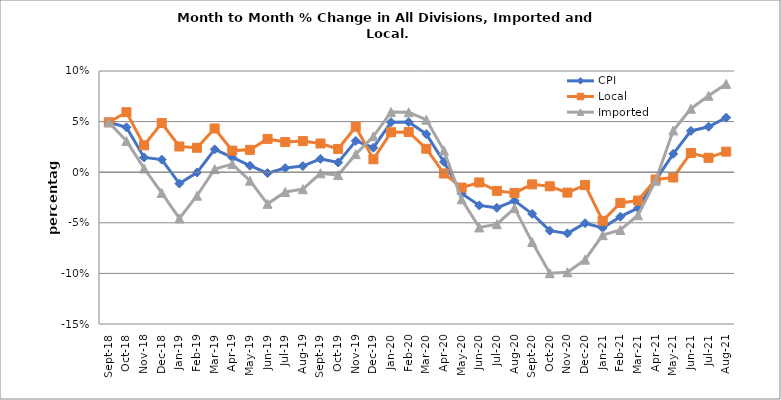
| Category | CPI | Local | Imported |
|---|---|---|---|
| 2018-09-01 | 0.049 | 0.049 | 0.049 |
| 2018-10-01 | 0.044 | 0.059 | 0.031 |
| 2018-11-01 | 0.015 | 0.027 | 0.004 |
| 2018-12-01 | 0.012 | 0.049 | -0.021 |
| 2019-01-01 | -0.011 | 0.025 | -0.046 |
| 2019-02-01 | 0 | 0.024 | -0.023 |
| 2019-03-01 | 0.023 | 0.043 | 0.003 |
| 2019-04-01 | 0.015 | 0.021 | 0.008 |
| 2019-05-01 | 0.006 | 0.022 | -0.008 |
| 2019-06-01 | -0.001 | 0.033 | -0.031 |
| 2019-07-01 | 0.004 | 0.03 | -0.02 |
| 2019-08-01 | 0.006 | 0.031 | -0.017 |
| 2019-09-01 | 0.013 | 0.028 | -0.001 |
| 2019-10-01 | 0.01 | 0.023 | -0.003 |
| 2019-11-01 | 0.031 | 0.045 | 0.018 |
| 2019-12-01 | 0.024 | 0.013 | 0.035 |
| 2020-01-01 | 0.049 | 0.039 | 0.059 |
| 2020-02-01 | 0.05 | 0.04 | 0.059 |
| 2020-03-01 | 0.038 | 0.023 | 0.052 |
| 2020-04-01 | 0.01 | -0.001 | 0.021 |
| 2020-05-01 | -0.021 | -0.015 | -0.027 |
| 2020-06-01 | -0.033 | -0.01 | -0.055 |
| 2020-07-01 | -0.035 | -0.018 | -0.051 |
| 2020-08-01 | -0.028 | -0.02 | -0.036 |
| 2020-09-01 | -0.041 | -0.012 | -0.069 |
| 2020-10-01 | -0.058 | -0.014 | -0.1 |
| 2020-11-01 | -0.06 | -0.02 | -0.099 |
| 2020-12-01 | -0.05 | -0.013 | -0.086 |
| 2021-01-01 | -0.055 | -0.048 | -0.062 |
| 2021-02-01 | -0.044 | -0.03 | -0.057 |
| 2021-03-01 | -0.035 | -0.028 | -0.043 |
| 2021-04-01 | -0.008 | -0.007 | -0.008 |
| 2021-05-01 | 0.018 | -0.005 | 0.041 |
| 2021-06-01 | 0.041 | 0.019 | 0.063 |
| 2021-07-01 | 0.045 | 0.014 | 0.075 |
| 2021-08-01 | 0.054 | 0.02 | 0.087 |